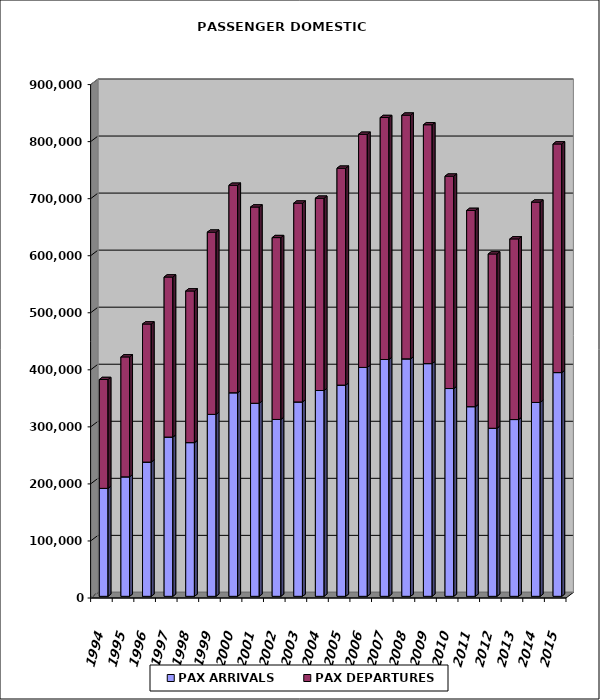
| Category | PAX ARRIVALS | PAX DEPARTURES |
|---|---|---|
| 1994.0 | 189277 | 190795 |
| 1995.0 | 209455 | 210246 |
| 1996.0 | 235325 | 242071 |
| 1997.0 | 279199 | 280569 |
| 1998.0 | 269461 | 265823 |
| 1999.0 | 318930 | 319459 |
| 2000.0 | 356883 | 363677 |
| 2001.0 | 338430 | 344039 |
| 2002.0 | 310074 | 318763 |
| 2003.0 | 340760 | 348555 |
| 2004.0 | 360778 | 337095 |
| 2005.0 | 370263 | 380213 |
| 2006.0 | 401280 | 408685 |
| 2007.0 | 415166 | 424160 |
| 2008.0 | 416295 | 427234 |
| 2009.0 | 407960 | 418717 |
| 2010.0 | 364260 | 372306 |
| 2011.0 | 332505 | 343958 |
| 2012.0 | 294635 | 305532 |
| 2013.0 | 309895 | 316699 |
| 2014.0 | 339902 | 351138 |
| 2015.0 | 392224 | 400801 |